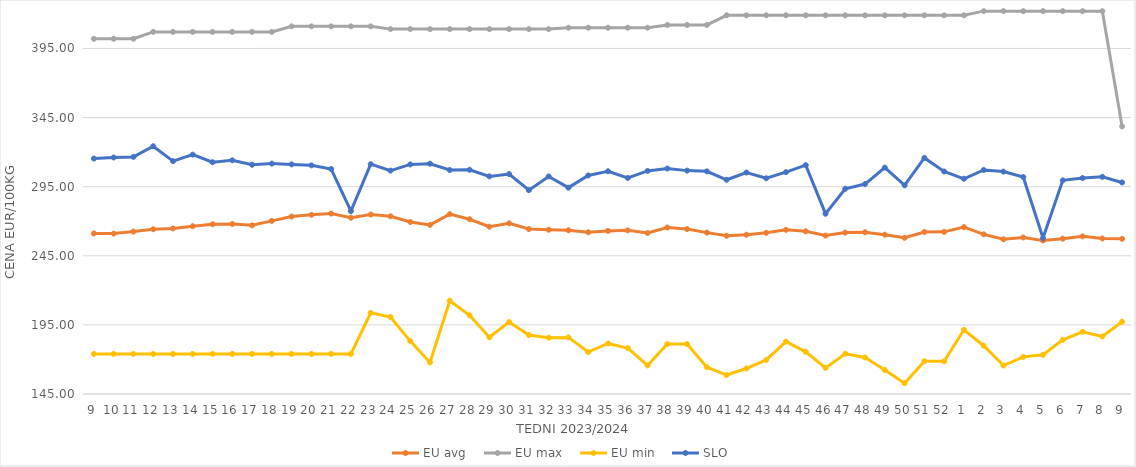
| Category | EU avg | EU max | EU min | SLO |
|---|---|---|---|---|
| 9.0 | 261.164 | 402 | 174 | 315.35 |
| 10.0 | 261.06 | 402 | 174 | 316.13 |
| 11.0 | 262.513 | 402 | 174 | 316.55 |
| 12.0 | 264.228 | 407 | 174 | 324.27 |
| 13.0 | 264.768 | 407 | 174 | 313.49 |
| 14.0 | 266.385 | 407 | 174 | 318.17 |
| 15.0 | 267.797 | 407 | 174 | 312.7 |
| 16.0 | 268.021 | 407 | 174 | 314.07 |
| 17.0 | 267.041 | 407 | 174 | 310.87 |
| 18.0 | 270.255 | 407 | 174 | 311.69 |
| 19.0 | 273.406 | 411 | 174 | 311.13 |
| 20.0 | 274.631 | 411 | 174 | 310.42 |
| 21.0 | 275.561 | 411 | 174 | 307.76 |
| 22.0 | 272.542 | 411 | 174 | 277.34 |
| 23.0 | 274.85 | 411 | 203.728 | 311.28 |
| 24.0 | 273.59 | 409 | 200.686 | 306.64 |
| 25.0 | 269.439 | 409 | 183.275 | 311.1 |
| 26.0 | 267.345 | 409 | 167.858 | 311.62 |
| 27.0 | 275.123 | 409 | 212.506 | 307.04 |
| 28.0 | 271.42 | 409 | 201.945 | 307.23 |
| 29.0 | 266.08 | 409 | 186.018 | 302.45 |
| 30.0 | 268.49 | 409 | 197.093 | 304.14 |
| 31.0 | 264.334 | 409 | 187.684 | 292.49 |
| 32.0 | 263.844 | 409 | 185.774 | 302.41 |
| 33.0 | 263.441 | 410 | 185.951 | 294.3 |
| 34.0 | 262.028 | 410 | 175.332 | 303.1 |
| 35.0 | 262.997 | 410 | 181.543 | 306.13 |
| 36.0 | 263.389 | 410 | 178.207 | 301.32 |
| 37.0 | 261.486 | 410 | 165.697 | 306.4 |
| 38.0 | 265.47 | 412 | 181.159 | 308.12 |
| 39.0 | 264.316 | 412 | 181.124 | 306.62 |
| 40.0 | 261.774 | 412 | 164.37 | 306.1 |
| 41.0 | 259.456 | 419 | 158.728 | 300 |
| 42.0 | 260.21 | 419 | 163.464 | 305.24 |
| 43.0 | 261.605 | 419 | 169.66 | 301.07 |
| 44.0 | 263.758 | 419 | 182.925 | 305.52 |
| 45.0 | 262.714 | 419 | 175.524 | 310.58 |
| 46.0 | 259.625 | 419 | 163.882 | 275.46 |
| 47.0 | 261.772 | 419 | 174.136 | 293.51 |
| 48.0 | 262.018 | 419 | 171.4 | 296.9 |
| 49.0 | 260.246 | 419 | 162.336 | 308.8 |
| 50.0 | 258.042 | 419 | 152.762 | 295.97 |
| 51.0 | 262.231 | 419 | 168.739 | 315.82 |
| 52.0 | 262.325 | 419 | 168.659 | 305.97 |
| 1.0 | 265.728 | 419 | 191.406 | 300.71 |
| 2.0 | 260.513 | 422 | 179.926 | 307.09 |
| 3.0 | 256.954 | 422 | 165.575 | 305.92 |
| 4.0 | 258.235 | 422 | 171.865 | 301.97 |
| 5.0 | 256.09 | 422 | 173.378 | 257.83 |
| 6.0 | 257.376 | 422 | 184.141 | 299.57 |
| 7.0 | 259.042 | 422 | 190.004 | 301.25 |
| 8.0 | 257.531 | 422 | 186.634 | 302.13 |
| 9.0 | 257.262 | 338.56 | 197.27 | 298.07 |